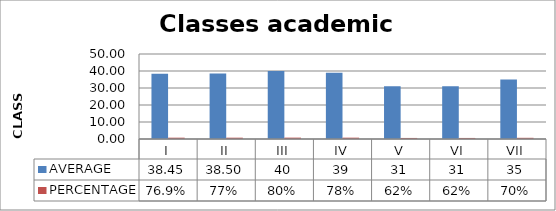
| Category | AVERAGE | PERCENTAGE |
|---|---|---|
| I | 38.45 | 0.769 |
| II | 38.5 | 0.77 |
| III | 40 | 0.8 |
| IV | 39 | 0.78 |
| V | 31 | 0.62 |
| VI | 31 | 0.62 |
| VII | 35 | 0.7 |